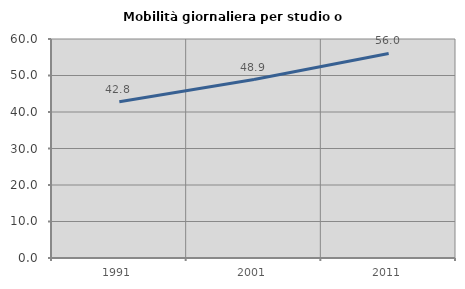
| Category | Mobilità giornaliera per studio o lavoro |
|---|---|
| 1991.0 | 42.813 |
| 2001.0 | 48.9 |
| 2011.0 | 56.044 |